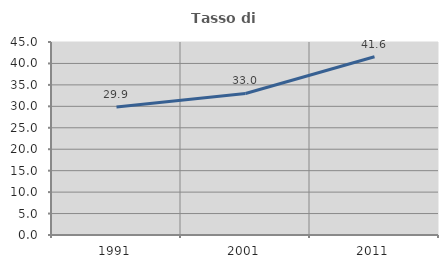
| Category | Tasso di occupazione   |
|---|---|
| 1991.0 | 29.86 |
| 2001.0 | 33 |
| 2011.0 | 41.562 |